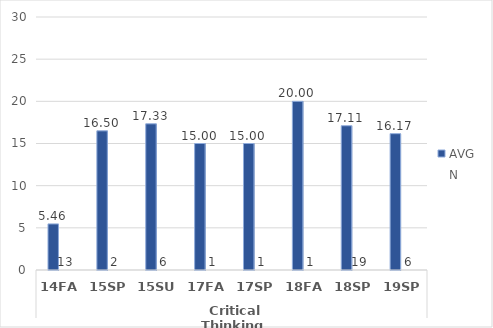
| Category | HS.AAS - AVG | HS.AAS - N |
|---|---|---|
| 0 | 5.462 | 13 |
| 1 | 16.5 | 2 |
| 2 | 17.333 | 6 |
| 3 | 15 | 1 |
| 4 | 15 | 1 |
| 5 | 20 | 1 |
| 6 | 17.105 | 19 |
| 7 | 16.167 | 6 |